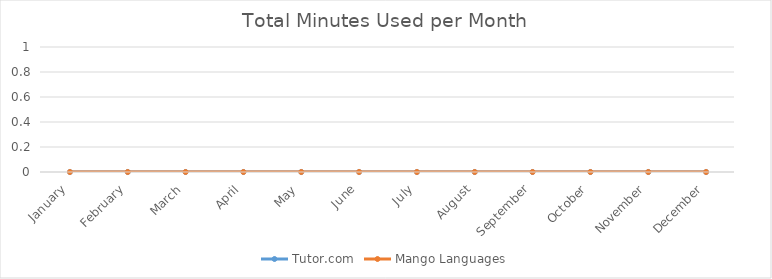
| Category | Tutor.com | Mango Languages |
|---|---|---|
| 0 | 0 | 0 |
| 1 | 0 | 0 |
| 2 | 0 | 0 |
| 3 | 0 | 0 |
| 4 | 0 | 0 |
| 5 | 0 | 0 |
| 6 | 0 | 0 |
| 7 | 0 | 0 |
| 8 | 0 | 0 |
| 9 | 0 | 0 |
| 10 | 0 | 0 |
| 11 | 0 | 0 |